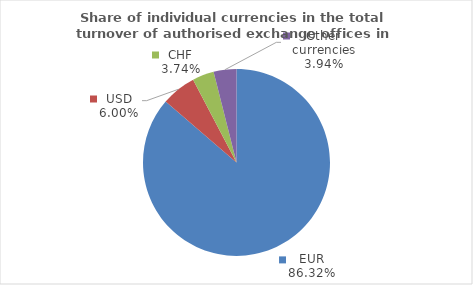
| Category | Series 0 |
|---|---|
| EUR | 86.316 |
| USD | 5.999 |
| CHF | 3.743 |
| Other currencies | 3.942 |